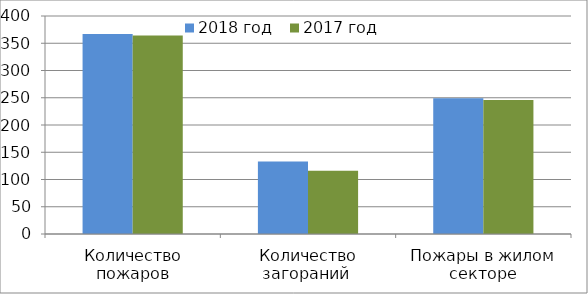
| Category | 2018 год | 2017 год |
|---|---|---|
| Количество пожаров | 367 | 364 |
| Количество загораний  | 133 | 116 |
| Пожары в жилом секторе | 249 | 246 |